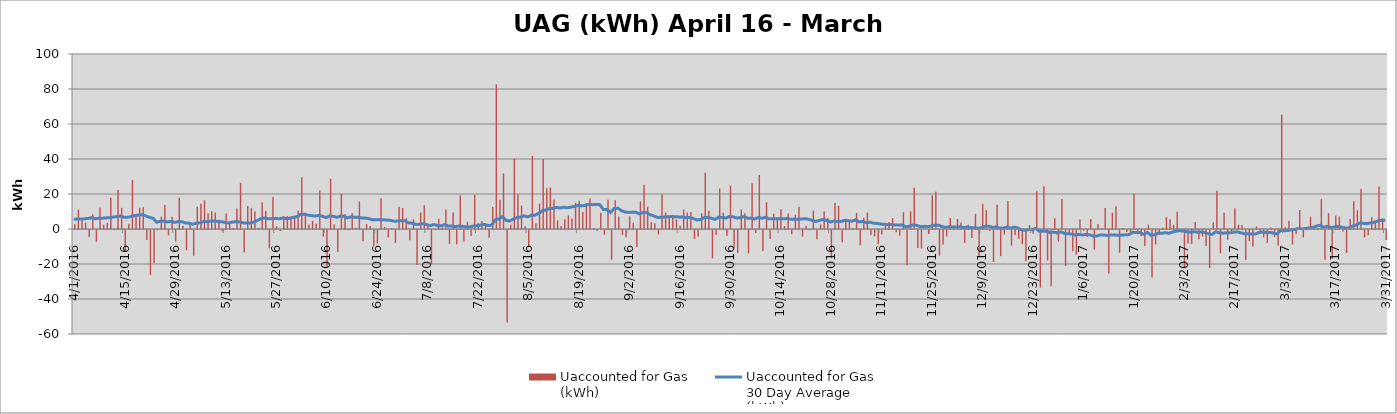
| Category | Uaccounted for Gas 
(kWh) |
|---|---|
| 4/1/16 | 2747858 |
| 4/2/16 | 10987249 |
| 4/3/16 | 4971341 |
| 4/4/16 | 3717906 |
| 4/5/16 | -4013066 |
| 4/6/16 | 8357660 |
| 4/7/16 | -6666343 |
| 4/8/16 | 12330201 |
| 4/9/16 | 2411081 |
| 4/10/16 | 3610171 |
| 4/11/16 | 17916954 |
| 4/12/16 | -39980 |
| 4/13/16 | 22291129 |
| 4/14/16 | 12089341 |
| 4/15/16 | -12388309 |
| 4/16/16 | 2954956 |
| 4/17/16 | 28032356 |
| 4/18/16 | 7630106 |
| 4/19/16 | 12194986 |
| 4/20/16 | 12359151 |
| 4/21/16 | -5673006 |
| 4/22/16 | -25780925 |
| 4/23/16 | -18972085 |
| 4/24/16 | -218906 |
| 4/25/16 | 6956983 |
| 4/26/16 | 13717921 |
| 4/27/16 | -3056522 |
| 4/28/16 | 6942179 |
| 4/29/16 | -6624262 |
| 4/30/16 | 17928392 |
| 5/1/16 | 1872096 |
| 5/2/16 | -11613748 |
| 5/3/16 | 2883097 |
| 5/4/16 | -14722521 |
| 5/5/16 | 12671728 |
| 5/6/16 | 14473853 |
| 5/7/16 | 16383154 |
| 5/8/16 | 9026183 |
| 5/9/16 | 10286304 |
| 5/10/16 | 9417301 |
| 5/11/16 | 5223985 |
| 5/12/16 | -739234 |
| 5/13/16 | 8892698 |
| 5/14/16 | 4005316 |
| 5/15/16 | 564509 |
| 5/16/16 | 11779407 |
| 5/17/16 | 26385147 |
| 5/18/16 | -12736341 |
| 5/19/16 | 13194191 |
| 5/20/16 | 11895440 |
| 5/21/16 | 10004135 |
| 5/22/16 | 726040 |
| 5/23/16 | 15123490 |
| 5/24/16 | 10237784 |
| 5/25/16 | -10526853 |
| 5/26/16 | 18323500 |
| 5/27/16 | 1508032 |
| 5/28/16 | -591883 |
| 5/29/16 | 7375942 |
| 5/30/16 | 7362594 |
| 5/31/16 | 7012977 |
| 6/1/16 | 6890521 |
| 6/2/16 | 10470917 |
| 6/3/16 | 29588070 |
| 6/4/16 | 9401068 |
| 6/5/16 | 2630983 |
| 6/6/16 | 4656331 |
| 6/7/16 | 3021136 |
| 6/8/16 | 21973435 |
| 6/9/16 | -3748070 |
| 6/10/16 | -21179469 |
| 6/11/16 | 28727680 |
| 6/12/16 | 2666875 |
| 6/13/16 | -12593680 |
| 6/14/16 | 20233542 |
| 6/15/16 | 8492768 |
| 6/16/16 | -226227 |
| 6/17/16 | 9038433 |
| 6/18/16 | 758960 |
| 6/19/16 | 15768394 |
| 6/20/16 | -6391839 |
| 6/21/16 | 2816300 |
| 6/22/16 | 1705207 |
| 6/23/16 | -8959810 |
| 6/24/16 | -7756670 |
| 6/25/16 | 17546263 |
| 6/26/16 | 1254748 |
| 6/27/16 | -4295473 |
| 6/28/16 | 274793 |
| 6/29/16 | -7430974 |
| 6/30/16 | 12727594 |
| 7/1/16 | 12029868 |
| 7/2/16 | 6184016 |
| 7/3/16 | -5812940 |
| 7/4/16 | 5537119 |
| 7/5/16 | -19944678 |
| 7/6/16 | 9367939 |
| 7/7/16 | 13509380 |
| 7/8/16 | 2721775 |
| 7/9/16 | -19496157 |
| 7/10/16 | -211371 |
| 7/11/16 | 5857602 |
| 7/12/16 | 904832 |
| 7/13/16 | 11076993 |
| 7/14/16 | -7954483 |
| 7/15/16 | 9577253 |
| 7/16/16 | -8204925 |
| 7/17/16 | 19206296 |
| 7/18/16 | -6580375 |
| 7/19/16 | 4109837 |
| 7/20/16 | -3361608 |
| 7/21/16 | 19554121 |
| 7/22/16 | 3427693 |
| 7/23/16 | 4627939 |
| 7/24/16 | 3361810 |
| 7/25/16 | -4417997 |
| 7/26/16 | 12638249 |
| 7/27/16 | 82671558 |
| 7/28/16 | 16765015 |
| 7/29/16 | 31766400 |
| 7/30/16 | -52867549 |
| 7/31/16 | 2458430 |
| 8/1/16 | 40289807 |
| 8/2/16 | 19871955 |
| 8/3/16 | 13271605 |
| 8/4/16 | 1631153 |
| 8/5/16 | -9380200 |
| 8/6/16 | 41777608 |
| 8/7/16 | 3333807 |
| 8/8/16 | 14466059 |
| 8/9/16 | 40070202 |
| 8/10/16 | 23232890 |
| 8/11/16 | 23718037 |
| 8/12/16 | 16890076 |
| 8/13/16 | 5003763 |
| 8/14/16 | 1677302 |
| 8/15/16 | 5374627 |
| 8/16/16 | 7755333 |
| 8/17/16 | 6011752 |
| 8/18/16 | 14825873 |
| 8/19/16 | 16162522 |
| 8/20/16 | 9664024 |
| 8/21/16 | 14803473 |
| 8/22/16 | 17424841 |
| 8/23/16 | 251740 |
| 8/24/16 | -478101 |
| 8/25/16 | 9270874 |
| 8/26/16 | -2667415 |
| 8/27/16 | 16658695 |
| 8/28/16 | -16956097 |
| 8/29/16 | 16443773 |
| 8/30/16 | 7195899 |
| 8/31/16 | -2754980 |
| 9/1/16 | -4195728 |
| 9/2/16 | 7236869 |
| 9/3/16 | 3530847 |
| 9/4/16 | -9665146 |
| 9/5/16 | 15741646 |
| 9/6/16 | 25313353 |
| 9/7/16 | 12705757 |
| 9/8/16 | 3788273 |
| 9/9/16 | 3297312 |
| 9/10/16 | -2533697 |
| 9/11/16 | 19719958 |
| 9/12/16 | 9356695 |
| 9/13/16 | 7552068 |
| 9/14/16 | 7603538 |
| 9/15/16 | 5495453 |
| 9/16/16 | 2036539 |
| 9/17/16 | 11188610 |
| 9/18/16 | 9389365 |
| 9/19/16 | 9672063 |
| 9/20/16 | -5108918 |
| 9/21/16 | -3874894 |
| 9/22/16 | 8962839 |
| 9/23/16 | 32136791 |
| 9/24/16 | 10379701 |
| 9/25/16 | -16176274 |
| 9/26/16 | -2796132 |
| 9/27/16 | 23202058 |
| 9/28/16 | 9304400 |
| 9/29/16 | -3482010 |
| 9/30/16 | 24695514 |
| 10/1/16 | -10562902 |
| 10/2/16 | -13121929 |
| 10/3/16 | 11217483 |
| 10/4/16 | 9004988 |
| 10/5/16 | -13353680 |
| 10/6/16 | 26145448 |
| 10/7/16 | -1705756 |
| 10/8/16 | 30890608 |
| 10/9/16 | -11976613 |
| 10/10/16 | 15303461 |
| 10/11/16 | -5214165 |
| 10/12/16 | 8710888 |
| 10/13/16 | 6194697 |
| 10/14/16 | 11256169 |
| 10/15/16 | 1683467 |
| 10/16/16 | 8926823 |
| 10/17/16 | -2366820 |
| 10/18/16 | 8116603 |
| 10/19/16 | 12738192 |
| 10/20/16 | -3812742 |
| 10/21/16 | 1914864 |
| 10/22/16 | -161653 |
| 10/23/16 | 10530596 |
| 10/24/16 | -5349970 |
| 10/25/16 | 2613667 |
| 10/26/16 | 10066119 |
| 10/27/16 | 6353071 |
| 10/28/16 | -16023223 |
| 10/29/16 | 14956837 |
| 10/30/16 | 13196414 |
| 10/31/16 | -6951657 |
| 11/1/16 | 5590894 |
| 11/2/16 | 4896630 |
| 11/3/16 | 447556 |
| 11/4/16 | 9182956 |
| 11/5/16 | -8645904 |
| 11/6/16 | 6452781 |
| 11/7/16 | 9427151 |
| 11/8/16 | -2874320 |
| 11/9/16 | -3628276 |
| 11/10/16 | -8122817 |
| 11/11/16 | -2500252 |
| 11/12/16 | 3051498 |
| 11/13/16 | 3997684 |
| 11/14/16 | 6257648 |
| 11/15/16 | -1322268 |
| 11/16/16 | -3276376 |
| 11/17/16 | 9587427 |
| 11/18/16 | -20136285 |
| 11/19/16 | 10048616 |
| 11/20/16 | 23569443 |
| 11/21/16 | -10239526 |
| 11/22/16 | -10604980 |
| 11/23/16 | -54752 |
| 11/24/16 | -2303136 |
| 11/25/16 | 19271363 |
| 11/26/16 | 21318234 |
| 11/27/16 | -14671256 |
| 11/28/16 | -8230982 |
| 11/29/16 | -3622604 |
| 11/30/16 | 6319067 |
| 12/1/16 | 1309623 |
| 12/2/16 | 5757947 |
| 12/3/16 | 3761496 |
| 12/4/16 | -7365564 |
| 12/5/16 | 2528649 |
| 12/6/16 | -4523978 |
| 12/7/16 | 8630033 |
| 12/8/16 | -15113093 |
| 12/9/16 | 14363784 |
| 12/10/16 | 10765759 |
| 12/11/16 | -610813 |
| 12/12/16 | -18256861 |
| 12/13/16 | 13810600 |
| 12/14/16 | -14926309 |
| 12/15/16 | -2545649 |
| 12/16/16 | 15974253 |
| 12/17/16 | -8980637 |
| 12/18/16 | -2843949 |
| 12/19/16 | -4984360 |
| 12/20/16 | -8115100 |
| 12/21/16 | -17829129 |
| 12/22/16 | 2263689 |
| 12/23/16 | -2115083 |
| 12/24/16 | 21535315 |
| 12/25/16 | -32939538 |
| 12/26/16 | 24433434 |
| 12/27/16 | -17432857 |
| 12/28/16 | -32169774 |
| 12/29/16 | 6183196 |
| 12/30/16 | -6596187 |
| 12/31/16 | 17134252 |
| 1/1/17 | -20597398 |
| 1/2/17 | -2104624 |
| 1/3/17 | -12181685 |
| 1/4/17 | -14084543 |
| 1/5/17 | 5406819 |
| 1/6/17 | -414795 |
| 1/7/17 | -4011372 |
| 1/8/17 | 5710766 |
| 1/9/17 | -11202968 |
| 1/10/17 | 2853705 |
| 1/11/17 | 155040 |
| 1/12/17 | 11998996 |
| 1/13/17 | -24865164 |
| 1/14/17 | 9316219 |
| 1/15/17 | 12975734 |
| 1/16/17 | -12947537 |
| 1/17/17 | 614871 |
| 1/18/17 | -1112403 |
| 1/19/17 | -1563743 |
| 1/20/17 | 20206608 |
| 1/21/17 | -2480854 |
| 1/22/17 | -3614935 |
| 1/23/17 | -9171226 |
| 1/24/17 | 2443619 |
| 1/25/17 | -27085630 |
| 1/26/17 | -8171555 |
| 1/27/17 | -2760230 |
| 1/28/17 | 755709 |
| 1/29/17 | 6855057 |
| 1/30/17 | 5562083 |
| 1/31/17 | 2441501 |
| 2/1/17 | 9864224 |
| 2/2/17 | -158717 |
| 2/3/17 | -21634432 |
| 2/4/17 | -7778161 |
| 2/5/17 | -7950046 |
| 2/6/17 | 4017711 |
| 2/7/17 | -5275145 |
| 2/8/17 | -3656475 |
| 2/9/17 | -9147258 |
| 2/10/17 | -21684558 |
| 2/11/17 | 3704956 |
| 2/12/17 | 21887261 |
| 2/13/17 | -13284117 |
| 2/14/17 | 9239229 |
| 2/15/17 | -5586096 |
| 2/16/17 | -649950 |
| 2/17/17 | 11881323 |
| 2/18/17 | 2426478 |
| 2/19/17 | 2282367 |
| 2/20/17 | -17048556 |
| 2/21/17 | -6382876 |
| 2/22/17 | -9457201 |
| 2/23/17 | 1430378 |
| 2/24/17 | -537242 |
| 2/25/17 | -4167017 |
| 2/26/17 | -7478267 |
| 2/27/17 | 809297 |
| 2/28/17 | -3983838 |
| 3/1/17 | -8866071 |
| 3/2/17 | 65320505 |
| 3/3/17 | 1046184 |
| 3/4/17 | 4526122 |
| 3/5/17 | -8227601 |
| 3/6/17 | -2463328 |
| 3/7/17 | 10811048 |
| 3/8/17 | -4204403 |
| 3/9/17 | -73448 |
| 3/10/17 | 7075741 |
| 3/11/17 | 1264092 |
| 3/12/17 | 423903 |
| 3/13/17 | 17095740 |
| 3/14/17 | -16968580 |
| 3/15/17 | 9064636 |
| 3/16/17 | -16574910 |
| 3/17/17 | 7718663 |
| 3/18/17 | 7131379 |
| 3/19/17 | -858264 |
| 3/20/17 | -13108072 |
| 3/21/17 | 5685970 |
| 3/22/17 | 15864785 |
| 3/23/17 | 10731268 |
| 3/24/17 | 22837857 |
| 3/25/17 | -4178394 |
| 3/26/17 | -2945436 |
| 3/27/17 | 6765886 |
| 3/28/17 | 3683013 |
| 3/29/17 | 24318780 |
| 3/30/17 | 6017148 |
| 3/31/17 | -5657031 |